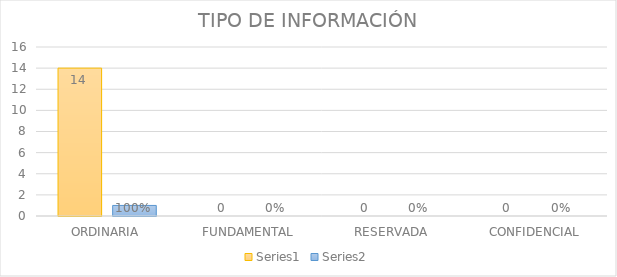
| Category | Series 3 | Series 4 |
|---|---|---|
| ORDINARIA | 14 | 1 |
| FUNDAMENTAL | 0 | 0 |
| RESERVADA | 0 | 0 |
| CONFIDENCIAL | 0 | 0 |